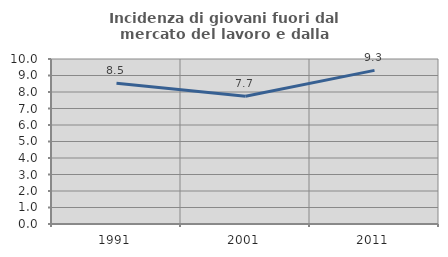
| Category | Incidenza di giovani fuori dal mercato del lavoro e dalla formazione  |
|---|---|
| 1991.0 | 8.535 |
| 2001.0 | 7.738 |
| 2011.0 | 9.309 |